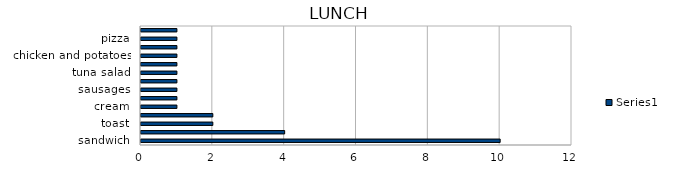
| Category | Series 0 |
|---|---|
| sandwich | 10 |
| fruit | 4 |
| toast | 2 |
| yoghurt | 2 |
| cream | 1 |
| eggs | 1 |
| sausages | 1 |
| baked beans | 1 |
| tuna salad | 1 |
| doughnut | 1 |
| chicken and potatoes | 1 |
| red borsch | 1 |
| pizza | 1 |
| bun | 1 |